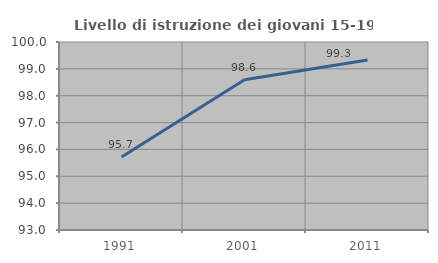
| Category | Livello di istruzione dei giovani 15-19 anni |
|---|---|
| 1991.0 | 95.714 |
| 2001.0 | 98.592 |
| 2011.0 | 99.329 |